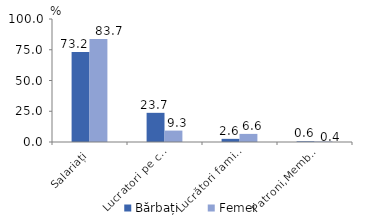
| Category | Bărbați | Femei |
|---|---|---|
| Salariați | 73.158 | 83.7 |
| Lucratori pe cont propriu | 23.72 | 9.275 |
| Lucrători familiali neremunerați | 2.564 | 6.593 |
| Patroni,Membri ai cooperativei | 0.557 | 0.432 |